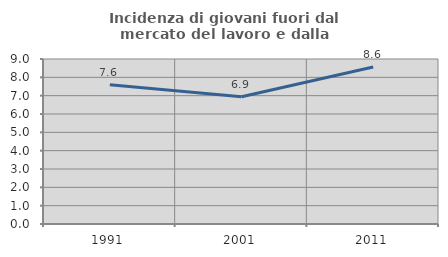
| Category | Incidenza di giovani fuori dal mercato del lavoro e dalla formazione  |
|---|---|
| 1991.0 | 7.592 |
| 2001.0 | 6.938 |
| 2011.0 | 8.564 |